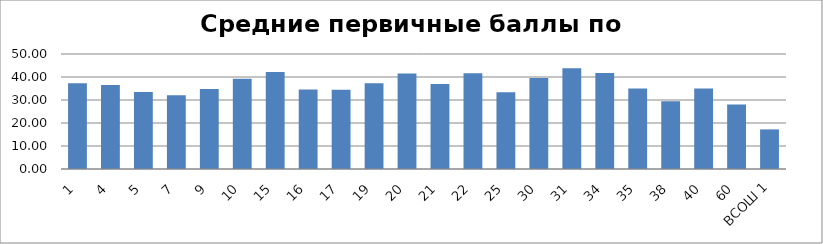
| Category | ОУ |
|---|---|
| 1 | 37.282 |
| 4 | 36.542 |
| 5 | 33.438 |
| 7 | 32.056 |
| 9 | 34.792 |
| 10 | 39.213 |
| 15 | 42.146 |
| 16 | 34.613 |
| 17 | 34.457 |
| 19 | 37.231 |
| 20 | 41.542 |
| 21 | 36.96 |
| 22 | 41.654 |
| 25 | 33.417 |
| 30 | 39.522 |
| 31 | 43.85 |
| 34 | 41.724 |
| 35 | 35.042 |
| 38 | 29.5 |
| 40 | 35.039 |
| 60 | 28.087 |
| ВСОШ 1 | 17.222 |